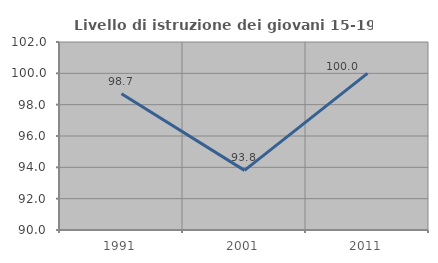
| Category | Livello di istruzione dei giovani 15-19 anni |
|---|---|
| 1991.0 | 98.693 |
| 2001.0 | 93.805 |
| 2011.0 | 100 |